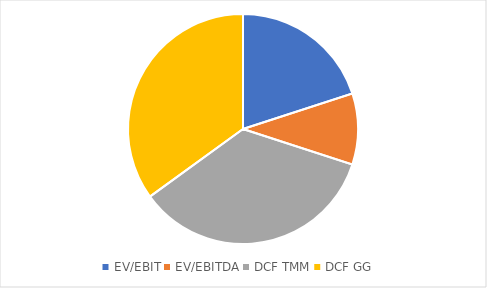
| Category | Series 0 |
|---|---|
| EV/EBIT | 0.2 |
| EV/EBITDA | 0.1 |
| DCF TMM | 0.35 |
| DCF GG | 0.35 |